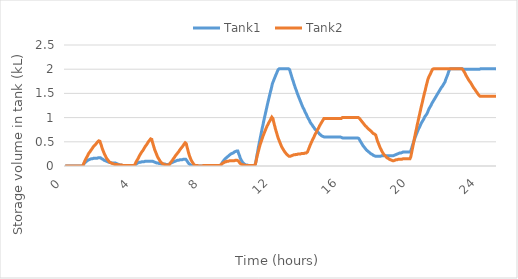
| Category | Tank1  | Tank2 |
|---|---|---|
| 0.0 | 0 | 0 |
| 0.016666666666666666 | 0 | 0 |
| 0.03333333333333333 | 0 | 0 |
| 0.05 | 0 | 0 |
| 0.06666666666666667 | 0 | 0 |
| 0.08333333333333333 | 0 | 0 |
| 0.09999999999999999 | 0 | 0 |
| 0.11666666666666665 | 0 | 0 |
| 0.13333333333333333 | 0 | 0 |
| 0.15 | 0 | 0 |
| 0.16666666666666666 | 0 | 0 |
| 0.18333333333333332 | 0 | 0 |
| 0.19999999999999998 | 0 | 0 |
| 0.21666666666666665 | 0 | 0 |
| 0.2333333333333333 | 0 | 0 |
| 0.24999999999999997 | 0 | 0 |
| 0.26666666666666666 | 0 | 0 |
| 0.2833333333333333 | 0 | 0 |
| 0.3 | 0 | 0 |
| 0.31666666666666665 | 0 | 0 |
| 0.3333333333333333 | 0 | 0 |
| 0.35 | 0 | 0 |
| 0.36666666666666664 | 0 | 0 |
| 0.3833333333333333 | 0 | 0 |
| 0.39999999999999997 | 0 | 0 |
| 0.41666666666666663 | 0 | 0 |
| 0.4333333333333333 | 0 | 0 |
| 0.44999999999999996 | 0 | 0 |
| 0.4666666666666666 | 0 | 0 |
| 0.4833333333333333 | 0 | 0 |
| 0.49999999999999994 | 0 | 0 |
| 0.5166666666666666 | 0 | 0 |
| 0.5333333333333333 | 0 | 0 |
| 0.55 | 0 | 0 |
| 0.5666666666666668 | 0 | 0 |
| 0.5833333333333335 | 0 | 0 |
| 0.6000000000000002 | 0 | 0 |
| 0.6166666666666669 | 0 | 0 |
| 0.6333333333333336 | 0 | 0 |
| 0.6500000000000004 | 0 | 0 |
| 0.6666666666666671 | 0 | 0 |
| 0.6833333333333338 | 0 | 0 |
| 0.7000000000000005 | 0 | 0 |
| 0.7166666666666672 | 0 | 0 |
| 0.733333333333334 | 0 | 0 |
| 0.7500000000000007 | 0 | 0 |
| 0.7666666666666674 | 0 | 0 |
| 0.7833333333333341 | 0 | 0 |
| 0.8000000000000008 | 0 | 0 |
| 0.8166666666666675 | 0 | 0 |
| 0.8333333333333343 | 0 | 0 |
| 0.850000000000001 | 0 | 0 |
| 0.8666666666666677 | 0 | 0 |
| 0.8833333333333344 | 0 | 0 |
| 0.9000000000000011 | 0 | 0 |
| 0.9166666666666679 | 0 | 0 |
| 0.9333333333333346 | 0 | 0 |
| 0.9500000000000013 | 0 | 0 |
| 0.966666666666668 | 0 | 0 |
| 0.9833333333333347 | 0 | 0 |
| 1.0000000000000013 | 0 | 0 |
| 1.016666666666668 | 0.01 | 0.01 |
| 1.0333333333333345 | 0.01 | 0.02 |
| 1.0500000000000012 | 0.02 | 0.03 |
| 1.0666666666666678 | 0.03 | 0.04 |
| 1.0833333333333344 | 0.04 | 0.05 |
| 1.100000000000001 | 0.05 | 0.07 |
| 1.1166666666666676 | 0.06 | 0.08 |
| 1.1333333333333342 | 0.06 | 0.09 |
| 1.1500000000000008 | 0.07 | 0.11 |
| 1.1666666666666674 | 0.08 | 0.12 |
| 1.183333333333334 | 0.08 | 0.13 |
| 1.2000000000000006 | 0.09 | 0.15 |
| 1.2166666666666672 | 0.09 | 0.16 |
| 1.2333333333333338 | 0.1 | 0.17 |
| 1.2500000000000004 | 0.1 | 0.18 |
| 1.266666666666667 | 0.11 | 0.19 |
| 1.2833333333333337 | 0.11 | 0.2 |
| 1.3000000000000003 | 0.12 | 0.21 |
| 1.3166666666666669 | 0.12 | 0.23 |
| 1.3333333333333335 | 0.12 | 0.24 |
| 1.35 | 0.13 | 0.25 |
| 1.3666666666666667 | 0.13 | 0.26 |
| 1.3833333333333333 | 0.13 | 0.27 |
| 1.4 | 0.13 | 0.28 |
| 1.4166666666666665 | 0.14 | 0.28 |
| 1.4333333333333331 | 0.14 | 0.29 |
| 1.4499999999999997 | 0.14 | 0.3 |
| 1.4666666666666663 | 0.14 | 0.31 |
| 1.483333333333333 | 0.14 | 0.32 |
| 1.4999999999999996 | 0.15 | 0.33 |
| 1.5166666666666662 | 0.15 | 0.34 |
| 1.5333333333333328 | 0.15 | 0.35 |
| 1.5499999999999994 | 0.15 | 0.35 |
| 1.566666666666666 | 0.15 | 0.36 |
| 1.5833333333333326 | 0.15 | 0.37 |
| 1.5999999999999992 | 0.15 | 0.38 |
| 1.6166666666666658 | 0.15 | 0.39 |
| 1.6333333333333324 | 0.16 | 0.39 |
| 1.649999999999999 | 0.16 | 0.4 |
| 1.6666666666666656 | 0.16 | 0.41 |
| 1.6833333333333322 | 0.16 | 0.42 |
| 1.6999999999999988 | 0.16 | 0.42 |
| 1.7166666666666655 | 0.16 | 0.43 |
| 1.733333333333332 | 0.16 | 0.44 |
| 1.7499999999999987 | 0.16 | 0.44 |
| 1.7666666666666653 | 0.16 | 0.45 |
| 1.7833333333333319 | 0.16 | 0.46 |
| 1.7999999999999985 | 0.16 | 0.46 |
| 1.816666666666665 | 0.16 | 0.47 |
| 1.8333333333333317 | 0.16 | 0.48 |
| 1.8499999999999983 | 0.16 | 0.48 |
| 1.866666666666665 | 0.17 | 0.49 |
| 1.8833333333333315 | 0.17 | 0.5 |
| 1.8999999999999981 | 0.17 | 0.5 |
| 1.9166666666666647 | 0.17 | 0.51 |
| 1.9333333333333313 | 0.17 | 0.51 |
| 1.949999999999998 | 0.17 | 0.52 |
| 1.9666666666666646 | 0.17 | 0.53 |
| 1.9833333333333312 | 0.17 | 0.53 |
| 1.9999999999999978 | 0.17 | 0.52 |
| 2.0166666666666644 | 0.17 | 0.51 |
| 2.033333333333331 | 0.17 | 0.49 |
| 2.0499999999999976 | 0.17 | 0.47 |
| 2.066666666666664 | 0.16 | 0.45 |
| 2.083333333333331 | 0.16 | 0.44 |
| 2.0999999999999974 | 0.16 | 0.42 |
| 2.116666666666664 | 0.15 | 0.4 |
| 2.1333333333333306 | 0.15 | 0.38 |
| 2.1499999999999972 | 0.14 | 0.36 |
| 2.166666666666664 | 0.14 | 0.35 |
| 2.1833333333333305 | 0.14 | 0.33 |
| 2.199999999999997 | 0.13 | 0.31 |
| 2.2166666666666637 | 0.13 | 0.3 |
| 2.2333333333333303 | 0.12 | 0.28 |
| 2.249999999999997 | 0.12 | 0.27 |
| 2.2666666666666635 | 0.12 | 0.26 |
| 2.28333333333333 | 0.11 | 0.24 |
| 2.2999999999999967 | 0.11 | 0.23 |
| 2.3166666666666633 | 0.11 | 0.22 |
| 2.33333333333333 | 0.1 | 0.21 |
| 2.3499999999999965 | 0.1 | 0.19 |
| 2.366666666666663 | 0.1 | 0.18 |
| 2.3833333333333298 | 0.1 | 0.17 |
| 2.3999999999999964 | 0.09 | 0.16 |
| 2.416666666666663 | 0.09 | 0.15 |
| 2.4333333333333296 | 0.09 | 0.15 |
| 2.449999999999996 | 0.09 | 0.14 |
| 2.466666666666663 | 0.09 | 0.13 |
| 2.4833333333333294 | 0.08 | 0.12 |
| 2.499999999999996 | 0.08 | 0.11 |
| 2.5166666666666626 | 0.08 | 0.11 |
| 2.533333333333329 | 0.08 | 0.1 |
| 2.549999999999996 | 0.08 | 0.09 |
| 2.5666666666666624 | 0.08 | 0.09 |
| 2.583333333333329 | 0.07 | 0.08 |
| 2.5999999999999956 | 0.07 | 0.08 |
| 2.6166666666666623 | 0.07 | 0.07 |
| 2.633333333333329 | 0.07 | 0.07 |
| 2.6499999999999955 | 0.07 | 0.07 |
| 2.666666666666662 | 0.07 | 0.06 |
| 2.6833333333333287 | 0.07 | 0.06 |
| 2.6999999999999953 | 0.07 | 0.05 |
| 2.716666666666662 | 0.06 | 0.05 |
| 2.7333333333333285 | 0.06 | 0.05 |
| 2.749999999999995 | 0.06 | 0.05 |
| 2.7666666666666617 | 0.06 | 0.04 |
| 2.7833333333333283 | 0.06 | 0.04 |
| 2.799999999999995 | 0.06 | 0.04 |
| 2.8166666666666615 | 0.06 | 0.04 |
| 2.833333333333328 | 0.06 | 0.04 |
| 2.8499999999999948 | 0.06 | 0.04 |
| 2.8666666666666614 | 0.06 | 0.03 |
| 2.883333333333328 | 0.06 | 0.03 |
| 2.8999999999999946 | 0.06 | 0.03 |
| 2.916666666666661 | 0.06 | 0.03 |
| 2.933333333333328 | 0.06 | 0.03 |
| 2.9499999999999944 | 0.06 | 0.03 |
| 2.966666666666661 | 0.05 | 0.03 |
| 2.9833333333333276 | 0.05 | 0.03 |
| 2.9999999999999942 | 0.05 | 0.03 |
| 3.016666666666661 | 0.05 | 0.03 |
| 3.0333333333333274 | 0.05 | 0.03 |
| 3.049999999999994 | 0.04 | 0.03 |
| 3.0666666666666607 | 0.04 | 0.03 |
| 3.0833333333333273 | 0.04 | 0.02 |
| 3.099999999999994 | 0.03 | 0.02 |
| 3.1166666666666605 | 0.03 | 0.02 |
| 3.133333333333327 | 0.03 | 0.02 |
| 3.1499999999999937 | 0.03 | 0.02 |
| 3.1666666666666603 | 0.02 | 0.02 |
| 3.183333333333327 | 0.02 | 0.02 |
| 3.1999999999999935 | 0.02 | 0.02 |
| 3.21666666666666 | 0.02 | 0.02 |
| 3.2333333333333267 | 0.02 | 0.02 |
| 3.2499999999999933 | 0.02 | 0.02 |
| 3.26666666666666 | 0.02 | 0.02 |
| 3.2833333333333266 | 0.01 | 0.02 |
| 3.299999999999993 | 0.01 | 0.02 |
| 3.3166666666666598 | 0.01 | 0.02 |
| 3.3333333333333264 | 0.01 | 0.02 |
| 3.349999999999993 | 0.01 | 0.01 |
| 3.3666666666666596 | 0.01 | 0.01 |
| 3.383333333333326 | 0.01 | 0.01 |
| 3.399999999999993 | 0.01 | 0.01 |
| 3.4166666666666594 | 0.01 | 0.01 |
| 3.433333333333326 | 0.01 | 0.01 |
| 3.4499999999999926 | 0.01 | 0.01 |
| 3.4666666666666592 | 0.01 | 0.01 |
| 3.483333333333326 | 0.01 | 0.01 |
| 3.4999999999999925 | 0.01 | 0.01 |
| 3.516666666666659 | 0.01 | 0.01 |
| 3.5333333333333257 | 0.01 | 0.01 |
| 3.5499999999999923 | 0.01 | 0.01 |
| 3.566666666666659 | 0.01 | 0.01 |
| 3.5833333333333255 | 0.01 | 0.01 |
| 3.599999999999992 | 0.01 | 0.01 |
| 3.6166666666666587 | 0.01 | 0.01 |
| 3.6333333333333253 | 0.01 | 0.01 |
| 3.649999999999992 | 0.01 | 0.01 |
| 3.6666666666666585 | 0.01 | 0.01 |
| 3.683333333333325 | 0.01 | 0.01 |
| 3.6999999999999917 | 0.01 | 0.01 |
| 3.7166666666666583 | 0.01 | 0.01 |
| 3.733333333333325 | 0.01 | 0.01 |
| 3.7499999999999916 | 0.01 | 0.01 |
| 3.766666666666658 | 0.01 | 0.01 |
| 3.7833333333333248 | 0.01 | 0.01 |
| 3.7999999999999914 | 0.01 | 0.01 |
| 3.816666666666658 | 0.01 | 0.01 |
| 3.8333333333333246 | 0.01 | 0.01 |
| 3.849999999999991 | 0.01 | 0.01 |
| 3.866666666666658 | 0.01 | 0.01 |
| 3.8833333333333244 | 0.01 | 0.01 |
| 3.899999999999991 | 0.01 | 0.01 |
| 3.9166666666666576 | 0.01 | 0.01 |
| 3.9333333333333242 | 0.01 | 0.01 |
| 3.949999999999991 | 0.01 | 0.01 |
| 3.9666666666666575 | 0.01 | 0.01 |
| 3.983333333333324 | 0.01 | 0.01 |
| 3.9999999999999907 | 0.01 | 0.02 |
| 4.016666666666658 | 0.01 | 0.02 |
| 4.033333333333324 | 0.02 | 0.03 |
| 4.049999999999991 | 0.02 | 0.04 |
| 4.0666666666666575 | 0.03 | 0.05 |
| 4.083333333333324 | 0.03 | 0.06 |
| 4.099999999999991 | 0.04 | 0.08 |
| 4.116666666666657 | 0.04 | 0.09 |
| 4.133333333333324 | 0.05 | 0.1 |
| 4.149999999999991 | 0.05 | 0.11 |
| 4.166666666666657 | 0.06 | 0.12 |
| 4.183333333333324 | 0.06 | 0.13 |
| 4.19999999999999 | 0.06 | 0.14 |
| 4.216666666666657 | 0.06 | 0.15 |
| 4.233333333333324 | 0.07 | 0.16 |
| 4.24999999999999 | 0.07 | 0.17 |
| 4.266666666666657 | 0.07 | 0.18 |
| 4.2833333333333234 | 0.07 | 0.2 |
| 4.29999999999999 | 0.08 | 0.21 |
| 4.316666666666657 | 0.08 | 0.22 |
| 4.333333333333323 | 0.08 | 0.23 |
| 4.34999999999999 | 0.08 | 0.24 |
| 4.3666666666666565 | 0.08 | 0.25 |
| 4.383333333333323 | 0.08 | 0.26 |
| 4.39999999999999 | 0.08 | 0.27 |
| 4.416666666666656 | 0.09 | 0.28 |
| 4.433333333333323 | 0.09 | 0.29 |
| 4.4499999999999895 | 0.09 | 0.3 |
| 4.466666666666656 | 0.09 | 0.3 |
| 4.483333333333323 | 0.09 | 0.31 |
| 4.499999999999989 | 0.09 | 0.32 |
| 4.516666666666656 | 0.09 | 0.33 |
| 4.533333333333323 | 0.09 | 0.34 |
| 4.549999999999989 | 0.09 | 0.35 |
| 4.566666666666656 | 0.09 | 0.36 |
| 4.583333333333322 | 0.09 | 0.37 |
| 4.599999999999989 | 0.09 | 0.38 |
| 4.616666666666656 | 0.09 | 0.39 |
| 4.633333333333322 | 0.1 | 0.4 |
| 4.649999999999989 | 0.1 | 0.41 |
| 4.666666666666655 | 0.1 | 0.42 |
| 4.683333333333322 | 0.1 | 0.43 |
| 4.699999999999989 | 0.1 | 0.43 |
| 4.716666666666655 | 0.1 | 0.44 |
| 4.733333333333322 | 0.1 | 0.45 |
| 4.7499999999999885 | 0.1 | 0.46 |
| 4.766666666666655 | 0.1 | 0.47 |
| 4.783333333333322 | 0.1 | 0.48 |
| 4.799999999999988 | 0.1 | 0.49 |
| 4.816666666666655 | 0.1 | 0.5 |
| 4.8333333333333215 | 0.1 | 0.5 |
| 4.849999999999988 | 0.1 | 0.51 |
| 4.866666666666655 | 0.1 | 0.52 |
| 4.883333333333321 | 0.1 | 0.53 |
| 4.899999999999988 | 0.1 | 0.54 |
| 4.9166666666666545 | 0.1 | 0.55 |
| 4.933333333333321 | 0.1 | 0.55 |
| 4.949999999999988 | 0.1 | 0.56 |
| 4.966666666666654 | 0.1 | 0.57 |
| 4.983333333333321 | 0.1 | 0.58 |
| 4.999999999999988 | 0.1 | 0.56 |
| 5.016666666666654 | 0.1 | 0.55 |
| 5.033333333333321 | 0.1 | 0.53 |
| 5.049999999999987 | 0.1 | 0.5 |
| 5.066666666666654 | 0.1 | 0.48 |
| 5.083333333333321 | 0.1 | 0.46 |
| 5.099999999999987 | 0.09 | 0.44 |
| 5.116666666666654 | 0.09 | 0.42 |
| 5.13333333333332 | 0.09 | 0.4 |
| 5.149999999999987 | 0.09 | 0.38 |
| 5.166666666666654 | 0.08 | 0.36 |
| 5.18333333333332 | 0.08 | 0.34 |
| 5.199999999999987 | 0.08 | 0.33 |
| 5.2166666666666535 | 0.07 | 0.31 |
| 5.23333333333332 | 0.07 | 0.29 |
| 5.249999999999987 | 0.07 | 0.28 |
| 5.266666666666653 | 0.07 | 0.26 |
| 5.28333333333332 | 0.07 | 0.25 |
| 5.2999999999999865 | 0.06 | 0.23 |
| 5.316666666666653 | 0.06 | 0.22 |
| 5.33333333333332 | 0.06 | 0.21 |
| 5.349999999999986 | 0.06 | 0.19 |
| 5.366666666666653 | 0.06 | 0.18 |
| 5.3833333333333195 | 0.06 | 0.17 |
| 5.399999999999986 | 0.05 | 0.16 |
| 5.416666666666653 | 0.05 | 0.15 |
| 5.433333333333319 | 0.05 | 0.14 |
| 5.449999999999986 | 0.05 | 0.13 |
| 5.466666666666653 | 0.05 | 0.12 |
| 5.483333333333319 | 0.05 | 0.11 |
| 5.499999999999986 | 0.05 | 0.1 |
| 5.516666666666652 | 0.05 | 0.09 |
| 5.533333333333319 | 0.04 | 0.09 |
| 5.549999999999986 | 0.04 | 0.08 |
| 5.566666666666652 | 0.04 | 0.07 |
| 5.583333333333319 | 0.04 | 0.07 |
| 5.599999999999985 | 0.04 | 0.06 |
| 5.616666666666652 | 0.04 | 0.06 |
| 5.633333333333319 | 0.04 | 0.05 |
| 5.649999999999985 | 0.04 | 0.05 |
| 5.666666666666652 | 0.04 | 0.05 |
| 5.6833333333333185 | 0.04 | 0.04 |
| 5.699999999999985 | 0.04 | 0.04 |
| 5.716666666666652 | 0.04 | 0.04 |
| 5.733333333333318 | 0.04 | 0.03 |
| 5.749999999999985 | 0.04 | 0.03 |
| 5.7666666666666515 | 0.04 | 0.03 |
| 5.783333333333318 | 0.04 | 0.03 |
| 5.799999999999985 | 0.04 | 0.02 |
| 5.816666666666651 | 0.04 | 0.02 |
| 5.833333333333318 | 0.04 | 0.02 |
| 5.8499999999999845 | 0.03 | 0.02 |
| 5.866666666666651 | 0.03 | 0.02 |
| 5.883333333333318 | 0.03 | 0.02 |
| 5.899999999999984 | 0.03 | 0.02 |
| 5.916666666666651 | 0.03 | 0.02 |
| 5.933333333333318 | 0.03 | 0.02 |
| 5.949999999999984 | 0.03 | 0.02 |
| 5.966666666666651 | 0.03 | 0.02 |
| 5.983333333333317 | 0.03 | 0.02 |
| 5.999999999999984 | 0.03 | 0.02 |
| 6.016666666666651 | 0.04 | 0.02 |
| 6.033333333333317 | 0.04 | 0.03 |
| 6.049999999999984 | 0.04 | 0.04 |
| 6.06666666666665 | 0.05 | 0.05 |
| 6.083333333333317 | 0.05 | 0.06 |
| 6.099999999999984 | 0.05 | 0.06 |
| 6.11666666666665 | 0.06 | 0.07 |
| 6.133333333333317 | 0.06 | 0.08 |
| 6.1499999999999835 | 0.06 | 0.09 |
| 6.16666666666665 | 0.07 | 0.1 |
| 6.183333333333317 | 0.07 | 0.11 |
| 6.199999999999983 | 0.07 | 0.11 |
| 6.21666666666665 | 0.08 | 0.12 |
| 6.2333333333333165 | 0.08 | 0.13 |
| 6.249999999999983 | 0.08 | 0.14 |
| 6.26666666666665 | 0.08 | 0.15 |
| 6.283333333333316 | 0.09 | 0.16 |
| 6.299999999999983 | 0.09 | 0.16 |
| 6.3166666666666496 | 0.09 | 0.17 |
| 6.333333333333316 | 0.09 | 0.18 |
| 6.349999999999983 | 0.1 | 0.19 |
| 6.366666666666649 | 0.1 | 0.2 |
| 6.383333333333316 | 0.1 | 0.21 |
| 6.399999999999983 | 0.1 | 0.21 |
| 6.416666666666649 | 0.1 | 0.22 |
| 6.433333333333316 | 0.11 | 0.23 |
| 6.449999999999982 | 0.11 | 0.24 |
| 6.466666666666649 | 0.11 | 0.25 |
| 6.483333333333316 | 0.11 | 0.25 |
| 6.499999999999982 | 0.11 | 0.26 |
| 6.516666666666649 | 0.12 | 0.27 |
| 6.5333333333333155 | 0.12 | 0.28 |
| 6.549999999999982 | 0.12 | 0.29 |
| 6.566666666666649 | 0.12 | 0.29 |
| 6.583333333333315 | 0.12 | 0.3 |
| 6.599999999999982 | 0.12 | 0.31 |
| 6.6166666666666485 | 0.12 | 0.32 |
| 6.633333333333315 | 0.12 | 0.33 |
| 6.649999999999982 | 0.13 | 0.33 |
| 6.666666666666648 | 0.13 | 0.34 |
| 6.683333333333315 | 0.13 | 0.35 |
| 6.6999999999999815 | 0.13 | 0.36 |
| 6.716666666666648 | 0.13 | 0.37 |
| 6.733333333333315 | 0.13 | 0.37 |
| 6.749999999999981 | 0.13 | 0.38 |
| 6.766666666666648 | 0.13 | 0.39 |
| 6.783333333333315 | 0.13 | 0.4 |
| 6.799999999999981 | 0.14 | 0.41 |
| 6.816666666666648 | 0.14 | 0.41 |
| 6.833333333333314 | 0.14 | 0.42 |
| 6.849999999999981 | 0.14 | 0.43 |
| 6.866666666666648 | 0.14 | 0.44 |
| 6.883333333333314 | 0.14 | 0.45 |
| 6.899999999999981 | 0.14 | 0.45 |
| 6.916666666666647 | 0.14 | 0.46 |
| 6.933333333333314 | 0.14 | 0.47 |
| 6.949999999999981 | 0.14 | 0.48 |
| 6.966666666666647 | 0.14 | 0.49 |
| 6.983333333333314 | 0.14 | 0.49 |
| 6.9999999999999805 | 0.14 | 0.47 |
| 7.016666666666647 | 0.13 | 0.46 |
| 7.033333333333314 | 0.12 | 0.43 |
| 7.04999999999998 | 0.11 | 0.41 |
| 7.066666666666647 | 0.1 | 0.38 |
| 7.0833333333333135 | 0.09 | 0.36 |
| 7.09999999999998 | 0.08 | 0.34 |
| 7.116666666666647 | 0.08 | 0.32 |
| 7.133333333333313 | 0.07 | 0.29 |
| 7.14999999999998 | 0.06 | 0.27 |
| 7.1666666666666465 | 0.05 | 0.25 |
| 7.183333333333313 | 0.05 | 0.23 |
| 7.19999999999998 | 0.04 | 0.21 |
| 7.216666666666646 | 0.03 | 0.2 |
| 7.233333333333313 | 0.03 | 0.18 |
| 7.24999999999998 | 0.02 | 0.16 |
| 7.266666666666646 | 0.02 | 0.15 |
| 7.283333333333313 | 0.02 | 0.13 |
| 7.299999999999979 | 0.01 | 0.12 |
| 7.316666666666646 | 0.01 | 0.11 |
| 7.333333333333313 | 0.01 | 0.1 |
| 7.349999999999979 | 0.01 | 0.09 |
| 7.366666666666646 | 0.01 | 0.08 |
| 7.383333333333312 | 0.01 | 0.07 |
| 7.399999999999979 | 0.01 | 0.06 |
| 7.416666666666646 | 0.01 | 0.05 |
| 7.433333333333312 | 0.01 | 0.04 |
| 7.449999999999979 | 0.01 | 0.04 |
| 7.4666666666666455 | 0 | 0.03 |
| 7.483333333333312 | 0 | 0.02 |
| 7.499999999999979 | 0 | 0.02 |
| 7.516666666666645 | 0 | 0.02 |
| 7.533333333333312 | 0 | 0.01 |
| 7.5499999999999785 | 0 | 0.01 |
| 7.566666666666645 | 0 | 0.01 |
| 7.583333333333312 | 0 | 0.01 |
| 7.599999999999978 | 0 | 0.01 |
| 7.616666666666645 | 0 | 0.01 |
| 7.6333333333333115 | 0 | 0.01 |
| 7.649999999999978 | 0 | 0.01 |
| 7.666666666666645 | 0 | 0.01 |
| 7.683333333333311 | 0 | 0 |
| 7.699999999999978 | 0 | 0 |
| 7.716666666666645 | 0 | 0 |
| 7.733333333333311 | 0 | 0 |
| 7.749999999999978 | 0 | 0 |
| 7.766666666666644 | 0 | 0 |
| 7.783333333333311 | 0 | 0 |
| 7.799999999999978 | 0 | 0 |
| 7.816666666666644 | 0 | 0 |
| 7.833333333333311 | 0 | 0 |
| 7.849999999999977 | 0 | 0 |
| 7.866666666666644 | 0 | 0 |
| 7.883333333333311 | 0 | 0 |
| 7.899999999999977 | 0 | 0 |
| 7.916666666666644 | 0 | 0 |
| 7.9333333333333105 | 0 | 0 |
| 7.949999999999977 | 0 | 0 |
| 7.966666666666644 | 0 | 0 |
| 7.98333333333331 | 0 | 0 |
| 7.999999999999977 | 0.01 | 0.01 |
| 8.016666666666644 | 0.01 | 0.01 |
| 8.033333333333312 | 0.01 | 0.01 |
| 8.04999999999998 | 0.01 | 0.01 |
| 8.066666666666647 | 0.01 | 0.01 |
| 8.083333333333314 | 0.01 | 0.01 |
| 8.099999999999982 | 0.01 | 0.01 |
| 8.11666666666665 | 0.01 | 0.01 |
| 8.133333333333317 | 0.01 | 0.01 |
| 8.149999999999984 | 0.01 | 0.01 |
| 8.166666666666652 | 0.01 | 0.01 |
| 8.18333333333332 | 0.01 | 0.01 |
| 8.199999999999987 | 0.01 | 0.01 |
| 8.216666666666654 | 0.01 | 0.01 |
| 8.233333333333322 | 0.01 | 0.01 |
| 8.24999999999999 | 0.01 | 0.01 |
| 8.266666666666657 | 0.01 | 0.01 |
| 8.283333333333324 | 0.01 | 0.01 |
| 8.299999999999992 | 0.01 | 0.01 |
| 8.31666666666666 | 0.01 | 0.01 |
| 8.333333333333327 | 0.01 | 0.01 |
| 8.349999999999994 | 0.01 | 0.01 |
| 8.366666666666662 | 0.01 | 0.01 |
| 8.38333333333333 | 0.01 | 0.01 |
| 8.399999999999997 | 0.01 | 0.01 |
| 8.416666666666664 | 0.01 | 0.01 |
| 8.433333333333332 | 0.01 | 0.01 |
| 8.45 | 0.01 | 0.01 |
| 8.466666666666667 | 0.01 | 0.01 |
| 8.483333333333334 | 0.01 | 0.01 |
| 8.500000000000002 | 0.01 | 0.01 |
| 8.51666666666667 | 0.01 | 0.01 |
| 8.533333333333337 | 0.01 | 0.01 |
| 8.550000000000004 | 0.01 | 0.01 |
| 8.566666666666672 | 0.01 | 0.01 |
| 8.58333333333334 | 0.01 | 0.01 |
| 8.600000000000007 | 0.01 | 0.01 |
| 8.616666666666674 | 0.01 | 0.01 |
| 8.633333333333342 | 0.01 | 0.01 |
| 8.65000000000001 | 0.01 | 0.01 |
| 8.666666666666677 | 0.01 | 0.01 |
| 8.683333333333344 | 0.01 | 0.01 |
| 8.700000000000012 | 0.01 | 0.01 |
| 8.71666666666668 | 0.01 | 0.01 |
| 8.733333333333347 | 0.01 | 0.01 |
| 8.750000000000014 | 0.01 | 0.01 |
| 8.766666666666682 | 0.01 | 0.01 |
| 8.78333333333335 | 0.01 | 0.01 |
| 8.800000000000017 | 0.01 | 0.01 |
| 8.816666666666684 | 0.01 | 0.01 |
| 8.833333333333352 | 0.01 | 0.01 |
| 8.85000000000002 | 0.01 | 0.01 |
| 8.866666666666687 | 0.01 | 0.01 |
| 8.883333333333354 | 0.01 | 0.01 |
| 8.900000000000022 | 0.01 | 0.01 |
| 8.91666666666669 | 0.01 | 0.01 |
| 8.933333333333357 | 0.01 | 0.01 |
| 8.950000000000024 | 0.01 | 0.01 |
| 8.966666666666692 | 0.01 | 0.01 |
| 8.98333333333336 | 0.01 | 0.01 |
| 9.000000000000027 | 0.02 | 0.02 |
| 9.016666666666694 | 0.02 | 0.02 |
| 9.033333333333362 | 0.03 | 0.03 |
| 9.05000000000003 | 0.04 | 0.03 |
| 9.066666666666697 | 0.05 | 0.04 |
| 9.083333333333364 | 0.06 | 0.04 |
| 9.100000000000032 | 0.07 | 0.05 |
| 9.1166666666667 | 0.08 | 0.05 |
| 9.133333333333367 | 0.09 | 0.06 |
| 9.150000000000034 | 0.1 | 0.06 |
| 9.166666666666702 | 0.1 | 0.07 |
| 9.183333333333369 | 0.11 | 0.07 |
| 9.200000000000037 | 0.12 | 0.07 |
| 9.216666666666704 | 0.13 | 0.08 |
| 9.233333333333372 | 0.13 | 0.08 |
| 9.250000000000039 | 0.14 | 0.08 |
| 9.266666666666707 | 0.15 | 0.09 |
| 9.283333333333374 | 0.15 | 0.09 |
| 9.300000000000042 | 0.16 | 0.09 |
| 9.316666666666709 | 0.17 | 0.09 |
| 9.333333333333377 | 0.17 | 0.09 |
| 9.350000000000044 | 0.18 | 0.1 |
| 9.366666666666712 | 0.18 | 0.1 |
| 9.383333333333379 | 0.19 | 0.1 |
| 9.400000000000047 | 0.19 | 0.1 |
| 9.416666666666714 | 0.2 | 0.1 |
| 9.433333333333382 | 0.2 | 0.1 |
| 9.450000000000049 | 0.21 | 0.1 |
| 9.466666666666717 | 0.21 | 0.1 |
| 9.483333333333384 | 0.22 | 0.1 |
| 9.500000000000052 | 0.22 | 0.11 |
| 9.516666666666719 | 0.23 | 0.11 |
| 9.533333333333387 | 0.23 | 0.11 |
| 9.550000000000054 | 0.23 | 0.11 |
| 9.566666666666721 | 0.24 | 0.11 |
| 9.583333333333389 | 0.24 | 0.11 |
| 9.600000000000056 | 0.25 | 0.11 |
| 9.616666666666724 | 0.25 | 0.11 |
| 9.633333333333391 | 0.25 | 0.11 |
| 9.650000000000059 | 0.26 | 0.11 |
| 9.666666666666726 | 0.26 | 0.11 |
| 9.683333333333394 | 0.26 | 0.11 |
| 9.700000000000061 | 0.27 | 0.11 |
| 9.716666666666729 | 0.27 | 0.11 |
| 9.733333333333396 | 0.27 | 0.11 |
| 9.750000000000064 | 0.28 | 0.11 |
| 9.766666666666731 | 0.28 | 0.11 |
| 9.783333333333399 | 0.28 | 0.11 |
| 9.800000000000066 | 0.29 | 0.11 |
| 9.816666666666734 | 0.29 | 0.11 |
| 9.833333333333401 | 0.29 | 0.12 |
| 9.850000000000069 | 0.29 | 0.12 |
| 9.866666666666736 | 0.3 | 0.12 |
| 9.883333333333404 | 0.3 | 0.12 |
| 9.900000000000071 | 0.3 | 0.12 |
| 9.916666666666739 | 0.3 | 0.12 |
| 9.933333333333406 | 0.31 | 0.12 |
| 9.950000000000074 | 0.31 | 0.12 |
| 9.966666666666741 | 0.31 | 0.12 |
| 9.983333333333409 | 0.31 | 0.12 |
| 10.000000000000076 | 0.31 | 0.11 |
| 10.016666666666744 | 0.29 | 0.11 |
| 10.033333333333411 | 0.27 | 0.1 |
| 10.050000000000079 | 0.26 | 0.09 |
| 10.066666666666746 | 0.24 | 0.09 |
| 10.083333333333414 | 0.22 | 0.08 |
| 10.100000000000081 | 0.21 | 0.07 |
| 10.116666666666749 | 0.19 | 0.06 |
| 10.133333333333416 | 0.17 | 0.06 |
| 10.150000000000084 | 0.16 | 0.05 |
| 10.166666666666751 | 0.15 | 0.05 |
| 10.183333333333419 | 0.13 | 0.04 |
| 10.200000000000086 | 0.12 | 0.04 |
| 10.216666666666754 | 0.11 | 0.03 |
| 10.233333333333421 | 0.1 | 0.03 |
| 10.250000000000089 | 0.09 | 0.03 |
| 10.266666666666756 | 0.08 | 0.03 |
| 10.283333333333424 | 0.07 | 0.02 |
| 10.300000000000091 | 0.07 | 0.02 |
| 10.316666666666759 | 0.06 | 0.02 |
| 10.333333333333426 | 0.05 | 0.02 |
| 10.350000000000094 | 0.05 | 0.02 |
| 10.366666666666761 | 0.04 | 0.02 |
| 10.383333333333429 | 0.04 | 0.02 |
| 10.400000000000096 | 0.04 | 0.01 |
| 10.416666666666764 | 0.03 | 0.01 |
| 10.433333333333431 | 0.03 | 0.01 |
| 10.450000000000099 | 0.03 | 0.01 |
| 10.466666666666766 | 0.02 | 0.01 |
| 10.483333333333434 | 0.02 | 0.01 |
| 10.500000000000101 | 0.02 | 0.01 |
| 10.516666666666769 | 0.02 | 0.01 |
| 10.533333333333436 | 0.02 | 0.01 |
| 10.550000000000104 | 0.02 | 0.01 |
| 10.566666666666771 | 0.02 | 0.01 |
| 10.583333333333439 | 0.01 | 0.01 |
| 10.600000000000106 | 0.01 | 0.01 |
| 10.616666666666774 | 0.01 | 0.01 |
| 10.633333333333441 | 0.01 | 0.01 |
| 10.650000000000109 | 0.01 | 0.01 |
| 10.666666666666776 | 0.01 | 0.01 |
| 10.683333333333444 | 0.01 | 0.01 |
| 10.700000000000111 | 0.01 | 0.01 |
| 10.716666666666779 | 0.01 | 0.01 |
| 10.733333333333446 | 0.01 | 0.01 |
| 10.750000000000114 | 0.01 | 0.01 |
| 10.766666666666781 | 0.01 | 0.01 |
| 10.783333333333449 | 0.01 | 0.01 |
| 10.800000000000116 | 0.01 | 0.01 |
| 10.816666666666784 | 0.01 | 0.01 |
| 10.833333333333451 | 0.01 | 0.01 |
| 10.850000000000119 | 0.01 | 0.01 |
| 10.866666666666786 | 0.01 | 0.01 |
| 10.883333333333454 | 0.01 | 0.01 |
| 10.900000000000121 | 0.01 | 0.01 |
| 10.916666666666789 | 0.01 | 0.01 |
| 10.933333333333456 | 0.01 | 0.01 |
| 10.950000000000124 | 0.01 | 0.01 |
| 10.966666666666791 | 0.01 | 0.01 |
| 10.983333333333459 | 0.01 | 0.01 |
| 11.000000000000126 | 0.02 | 0.02 |
| 11.016666666666794 | 0.04 | 0.04 |
| 11.033333333333461 | 0.07 | 0.06 |
| 11.050000000000129 | 0.1 | 0.09 |
| 11.066666666666796 | 0.14 | 0.12 |
| 11.083333333333464 | 0.17 | 0.15 |
| 11.100000000000131 | 0.2 | 0.17 |
| 11.116666666666799 | 0.24 | 0.2 |
| 11.133333333333466 | 0.27 | 0.23 |
| 11.150000000000134 | 0.3 | 0.25 |
| 11.166666666666801 | 0.33 | 0.27 |
| 11.183333333333469 | 0.37 | 0.3 |
| 11.200000000000136 | 0.4 | 0.32 |
| 11.216666666666804 | 0.43 | 0.34 |
| 11.233333333333471 | 0.46 | 0.36 |
| 11.250000000000139 | 0.49 | 0.39 |
| 11.266666666666806 | 0.52 | 0.41 |
| 11.283333333333474 | 0.55 | 0.43 |
| 11.300000000000141 | 0.58 | 0.45 |
| 11.316666666666809 | 0.61 | 0.47 |
| 11.333333333333476 | 0.64 | 0.48 |
| 11.350000000000144 | 0.67 | 0.5 |
| 11.366666666666811 | 0.7 | 0.52 |
| 11.383333333333479 | 0.73 | 0.54 |
| 11.400000000000146 | 0.76 | 0.56 |
| 11.416666666666814 | 0.79 | 0.57 |
| 11.433333333333481 | 0.81 | 0.59 |
| 11.450000000000149 | 0.84 | 0.61 |
| 11.466666666666816 | 0.87 | 0.62 |
| 11.483333333333483 | 0.9 | 0.64 |
| 11.500000000000151 | 0.93 | 0.66 |
| 11.516666666666818 | 0.95 | 0.67 |
| 11.533333333333486 | 0.98 | 0.69 |
| 11.550000000000153 | 1.01 | 0.7 |
| 11.566666666666821 | 1.03 | 0.72 |
| 11.583333333333488 | 1.06 | 0.73 |
| 11.600000000000156 | 1.09 | 0.75 |
| 11.616666666666823 | 1.11 | 0.76 |
| 11.633333333333491 | 1.14 | 0.77 |
| 11.650000000000158 | 1.17 | 0.79 |
| 11.666666666666826 | 1.19 | 0.8 |
| 11.683333333333493 | 1.22 | 0.81 |
| 11.700000000000161 | 1.25 | 0.83 |
| 11.716666666666828 | 1.27 | 0.84 |
| 11.733333333333496 | 1.3 | 0.85 |
| 11.750000000000163 | 1.32 | 0.86 |
| 11.766666666666831 | 1.35 | 0.88 |
| 11.783333333333498 | 1.37 | 0.89 |
| 11.800000000000166 | 1.4 | 0.9 |
| 11.816666666666833 | 1.42 | 0.91 |
| 11.833333333333501 | 1.45 | 0.92 |
| 11.850000000000168 | 1.47 | 0.93 |
| 11.866666666666836 | 1.5 | 0.94 |
| 11.883333333333503 | 1.52 | 0.95 |
| 11.90000000000017 | 1.55 | 0.97 |
| 11.916666666666838 | 1.57 | 0.98 |
| 11.933333333333506 | 1.59 | 0.99 |
| 11.950000000000173 | 1.62 | 1 |
| 11.96666666666684 | 1.64 | 1.01 |
| 11.983333333333508 | 1.67 | 1.02 |
| 12.000000000000176 | 1.7 | 1.01 |
| 12.016666666666843 | 1.72 | 0.99 |
| 12.03333333333351 | 1.73 | 0.98 |
| 12.050000000000178 | 1.75 | 0.95 |
| 12.066666666666846 | 1.76 | 0.93 |
| 12.083333333333513 | 1.78 | 0.9 |
| 12.10000000000018 | 1.79 | 0.88 |
| 12.116666666666848 | 1.81 | 0.85 |
| 12.133333333333516 | 1.82 | 0.83 |
| 12.150000000000183 | 1.83 | 0.81 |
| 12.16666666666685 | 1.85 | 0.78 |
| 12.183333333333518 | 1.86 | 0.76 |
| 12.200000000000186 | 1.88 | 0.74 |
| 12.216666666666853 | 1.89 | 0.72 |
| 12.23333333333352 | 1.9 | 0.7 |
| 12.250000000000188 | 1.92 | 0.68 |
| 12.266666666666856 | 1.93 | 0.66 |
| 12.283333333333523 | 1.95 | 0.64 |
| 12.30000000000019 | 1.96 | 0.62 |
| 12.316666666666858 | 1.97 | 0.6 |
| 12.333333333333526 | 1.99 | 0.58 |
| 12.350000000000193 | 2 | 0.57 |
| 12.36666666666686 | 2.01 | 0.55 |
| 12.383333333333528 | 2.01 | 0.53 |
| 12.400000000000196 | 2.01 | 0.52 |
| 12.416666666666863 | 2.01 | 0.5 |
| 12.43333333333353 | 2.01 | 0.49 |
| 12.450000000000198 | 2.01 | 0.47 |
| 12.466666666666866 | 2.01 | 0.46 |
| 12.483333333333533 | 2.01 | 0.44 |
| 12.5000000000002 | 2.01 | 0.43 |
| 12.516666666666868 | 2.01 | 0.42 |
| 12.533333333333536 | 2.01 | 0.41 |
| 12.550000000000203 | 2.01 | 0.39 |
| 12.56666666666687 | 2.01 | 0.38 |
| 12.583333333333538 | 2.01 | 0.37 |
| 12.600000000000206 | 2.01 | 0.36 |
| 12.616666666666873 | 2.01 | 0.35 |
| 12.63333333333354 | 2.01 | 0.34 |
| 12.650000000000208 | 2.01 | 0.33 |
| 12.666666666666876 | 2.01 | 0.32 |
| 12.683333333333543 | 2.01 | 0.31 |
| 12.70000000000021 | 2.01 | 0.3 |
| 12.716666666666878 | 2.01 | 0.29 |
| 12.733333333333546 | 2.01 | 0.28 |
| 12.750000000000213 | 2.01 | 0.28 |
| 12.76666666666688 | 2.01 | 0.27 |
| 12.783333333333548 | 2.01 | 0.26 |
| 12.800000000000216 | 2.01 | 0.25 |
| 12.816666666666883 | 2.01 | 0.25 |
| 12.83333333333355 | 2.01 | 0.24 |
| 12.850000000000218 | 2.01 | 0.24 |
| 12.866666666666886 | 2.01 | 0.23 |
| 12.883333333333553 | 2.01 | 0.22 |
| 12.90000000000022 | 2.01 | 0.22 |
| 12.916666666666888 | 2.01 | 0.21 |
| 12.933333333333556 | 2.01 | 0.21 |
| 12.950000000000223 | 2.01 | 0.2 |
| 12.96666666666689 | 2.01 | 0.2 |
| 12.983333333333558 | 2.01 | 0.2 |
| 13.000000000000226 | 1.99 | 0.2 |
| 13.016666666666893 | 1.97 | 0.2 |
| 13.03333333333356 | 1.95 | 0.2 |
| 13.050000000000228 | 1.93 | 0.21 |
| 13.066666666666896 | 1.91 | 0.21 |
| 13.083333333333563 | 1.89 | 0.21 |
| 13.10000000000023 | 1.87 | 0.21 |
| 13.116666666666898 | 1.85 | 0.21 |
| 13.133333333333566 | 1.83 | 0.22 |
| 13.150000000000233 | 1.81 | 0.22 |
| 13.1666666666669 | 1.79 | 0.22 |
| 13.183333333333568 | 1.77 | 0.22 |
| 13.200000000000236 | 1.76 | 0.22 |
| 13.216666666666903 | 1.74 | 0.22 |
| 13.23333333333357 | 1.72 | 0.23 |
| 13.250000000000238 | 1.7 | 0.23 |
| 13.266666666666906 | 1.68 | 0.23 |
| 13.283333333333573 | 1.67 | 0.23 |
| 13.30000000000024 | 1.65 | 0.23 |
| 13.316666666666908 | 1.63 | 0.23 |
| 13.333333333333576 | 1.61 | 0.23 |
| 13.350000000000243 | 1.6 | 0.24 |
| 13.36666666666691 | 1.58 | 0.24 |
| 13.383333333333578 | 1.56 | 0.24 |
| 13.400000000000245 | 1.55 | 0.24 |
| 13.416666666666913 | 1.53 | 0.24 |
| 13.43333333333358 | 1.51 | 0.24 |
| 13.450000000000248 | 1.5 | 0.24 |
| 13.466666666666915 | 1.48 | 0.24 |
| 13.483333333333583 | 1.46 | 0.24 |
| 13.50000000000025 | 1.45 | 0.25 |
| 13.516666666666918 | 1.43 | 0.25 |
| 13.533333333333585 | 1.42 | 0.25 |
| 13.550000000000253 | 1.4 | 0.25 |
| 13.56666666666692 | 1.39 | 0.25 |
| 13.583333333333588 | 1.37 | 0.25 |
| 13.600000000000255 | 1.36 | 0.25 |
| 13.616666666666923 | 1.34 | 0.25 |
| 13.63333333333359 | 1.33 | 0.25 |
| 13.650000000000258 | 1.31 | 0.25 |
| 13.666666666666925 | 1.3 | 0.26 |
| 13.683333333333593 | 1.29 | 0.26 |
| 13.70000000000026 | 1.27 | 0.26 |
| 13.716666666666928 | 1.26 | 0.26 |
| 13.733333333333595 | 1.24 | 0.26 |
| 13.750000000000263 | 1.23 | 0.26 |
| 13.76666666666693 | 1.22 | 0.26 |
| 13.783333333333598 | 1.2 | 0.26 |
| 13.800000000000265 | 1.19 | 0.26 |
| 13.816666666666933 | 1.18 | 0.26 |
| 13.8333333333336 | 1.17 | 0.26 |
| 13.850000000000268 | 1.15 | 0.26 |
| 13.866666666666935 | 1.14 | 0.26 |
| 13.883333333333603 | 1.13 | 0.26 |
| 13.90000000000027 | 1.12 | 0.27 |
| 13.916666666666938 | 1.1 | 0.27 |
| 13.933333333333605 | 1.09 | 0.27 |
| 13.950000000000273 | 1.08 | 0.27 |
| 13.96666666666694 | 1.07 | 0.27 |
| 13.983333333333608 | 1.06 | 0.27 |
| 14.000000000000275 | 1.04 | 0.28 |
| 14.016666666666943 | 1.03 | 0.28 |
| 14.03333333333361 | 1.02 | 0.29 |
| 14.050000000000278 | 1 | 0.3 |
| 14.066666666666945 | 0.99 | 0.32 |
| 14.083333333333613 | 0.98 | 0.33 |
| 14.10000000000028 | 0.97 | 0.35 |
| 14.116666666666948 | 0.96 | 0.36 |
| 14.133333333333615 | 0.95 | 0.38 |
| 14.150000000000283 | 0.94 | 0.39 |
| 14.16666666666695 | 0.92 | 0.41 |
| 14.183333333333618 | 0.91 | 0.42 |
| 14.200000000000285 | 0.9 | 0.44 |
| 14.216666666666953 | 0.89 | 0.45 |
| 14.23333333333362 | 0.88 | 0.46 |
| 14.250000000000288 | 0.87 | 0.48 |
| 14.266666666666955 | 0.87 | 0.49 |
| 14.283333333333623 | 0.86 | 0.5 |
| 14.30000000000029 | 0.85 | 0.52 |
| 14.316666666666958 | 0.84 | 0.53 |
| 14.333333333333625 | 0.83 | 0.54 |
| 14.350000000000293 | 0.82 | 0.56 |
| 14.36666666666696 | 0.81 | 0.57 |
| 14.383333333333628 | 0.8 | 0.58 |
| 14.400000000000295 | 0.8 | 0.59 |
| 14.416666666666963 | 0.79 | 0.61 |
| 14.43333333333363 | 0.78 | 0.62 |
| 14.450000000000298 | 0.77 | 0.63 |
| 14.466666666666965 | 0.76 | 0.64 |
| 14.483333333333633 | 0.76 | 0.66 |
| 14.5000000000003 | 0.75 | 0.67 |
| 14.516666666666968 | 0.74 | 0.68 |
| 14.533333333333635 | 0.74 | 0.69 |
| 14.550000000000303 | 0.73 | 0.7 |
| 14.56666666666697 | 0.72 | 0.71 |
| 14.583333333333638 | 0.72 | 0.73 |
| 14.600000000000305 | 0.71 | 0.74 |
| 14.616666666666973 | 0.7 | 0.75 |
| 14.63333333333364 | 0.7 | 0.76 |
| 14.650000000000308 | 0.69 | 0.77 |
| 14.666666666666975 | 0.69 | 0.78 |
| 14.683333333333643 | 0.68 | 0.79 |
| 14.70000000000031 | 0.67 | 0.8 |
| 14.716666666666978 | 0.67 | 0.81 |
| 14.733333333333645 | 0.66 | 0.83 |
| 14.750000000000313 | 0.66 | 0.84 |
| 14.76666666666698 | 0.65 | 0.85 |
| 14.783333333333648 | 0.65 | 0.86 |
| 14.800000000000315 | 0.64 | 0.87 |
| 14.816666666666983 | 0.64 | 0.88 |
| 14.83333333333365 | 0.63 | 0.89 |
| 14.850000000000318 | 0.63 | 0.9 |
| 14.866666666666985 | 0.62 | 0.91 |
| 14.883333333333653 | 0.62 | 0.92 |
| 14.90000000000032 | 0.61 | 0.93 |
| 14.916666666666988 | 0.61 | 0.94 |
| 14.933333333333655 | 0.61 | 0.95 |
| 14.950000000000323 | 0.6 | 0.96 |
| 14.96666666666699 | 0.6 | 0.97 |
| 14.983333333333658 | 0.59 | 0.98 |
| 15.000000000000325 | 0.6 | 0.98 |
| 15.016666666666993 | 0.6 | 0.98 |
| 15.03333333333366 | 0.6 | 0.98 |
| 15.050000000000328 | 0.6 | 0.98 |
| 15.066666666666995 | 0.6 | 0.98 |
| 15.083333333333663 | 0.6 | 0.98 |
| 15.10000000000033 | 0.6 | 0.98 |
| 15.116666666666998 | 0.6 | 0.98 |
| 15.133333333333665 | 0.6 | 0.98 |
| 15.150000000000333 | 0.6 | 0.98 |
| 15.166666666667 | 0.6 | 0.98 |
| 15.183333333333668 | 0.6 | 0.98 |
| 15.200000000000335 | 0.6 | 0.98 |
| 15.216666666667003 | 0.6 | 0.98 |
| 15.23333333333367 | 0.6 | 0.98 |
| 15.250000000000338 | 0.6 | 0.98 |
| 15.266666666667005 | 0.6 | 0.98 |
| 15.283333333333672 | 0.6 | 0.98 |
| 15.30000000000034 | 0.6 | 0.98 |
| 15.316666666667007 | 0.6 | 0.98 |
| 15.333333333333675 | 0.6 | 0.98 |
| 15.350000000000342 | 0.6 | 0.98 |
| 15.36666666666701 | 0.6 | 0.98 |
| 15.383333333333677 | 0.6 | 0.98 |
| 15.400000000000345 | 0.6 | 0.98 |
| 15.416666666667012 | 0.6 | 0.98 |
| 15.43333333333368 | 0.6 | 0.98 |
| 15.450000000000347 | 0.6 | 0.98 |
| 15.466666666667015 | 0.6 | 0.98 |
| 15.483333333333682 | 0.6 | 0.98 |
| 15.50000000000035 | 0.6 | 0.98 |
| 15.516666666667017 | 0.6 | 0.98 |
| 15.533333333333685 | 0.6 | 0.98 |
| 15.550000000000352 | 0.6 | 0.98 |
| 15.56666666666702 | 0.6 | 0.98 |
| 15.583333333333687 | 0.6 | 0.98 |
| 15.600000000000355 | 0.6 | 0.98 |
| 15.616666666667022 | 0.6 | 0.98 |
| 15.63333333333369 | 0.6 | 0.98 |
| 15.650000000000357 | 0.6 | 0.98 |
| 15.666666666667025 | 0.6 | 0.98 |
| 15.683333333333692 | 0.6 | 0.98 |
| 15.70000000000036 | 0.6 | 0.98 |
| 15.716666666667027 | 0.6 | 0.98 |
| 15.733333333333695 | 0.6 | 0.98 |
| 15.750000000000362 | 0.6 | 0.98 |
| 15.76666666666703 | 0.6 | 0.98 |
| 15.783333333333697 | 0.6 | 0.98 |
| 15.800000000000365 | 0.6 | 0.98 |
| 15.816666666667032 | 0.6 | 0.98 |
| 15.8333333333337 | 0.6 | 0.98 |
| 15.850000000000367 | 0.6 | 0.98 |
| 15.866666666667035 | 0.6 | 0.98 |
| 15.883333333333702 | 0.6 | 0.98 |
| 15.90000000000037 | 0.6 | 0.98 |
| 15.916666666667037 | 0.6 | 0.98 |
| 15.933333333333705 | 0.6 | 0.98 |
| 15.950000000000372 | 0.6 | 0.98 |
| 15.96666666666704 | 0.6 | 0.98 |
| 15.983333333333707 | 0.6 | 0.98 |
| 16.000000000000373 | 0.59 | 0.99 |
| 16.01666666666704 | 0.58 | 1 |
| 16.033333333333704 | 0.58 | 1 |
| 16.05000000000037 | 0.58 | 1 |
| 16.066666666667036 | 0.58 | 1 |
| 16.0833333333337 | 0.58 | 1 |
| 16.100000000000367 | 0.58 | 1 |
| 16.116666666667033 | 0.58 | 1 |
| 16.1333333333337 | 0.58 | 1 |
| 16.150000000000365 | 0.58 | 1 |
| 16.16666666666703 | 0.58 | 1 |
| 16.183333333333696 | 0.58 | 1 |
| 16.20000000000036 | 0.58 | 1 |
| 16.216666666667027 | 0.58 | 1 |
| 16.233333333333693 | 0.58 | 1 |
| 16.25000000000036 | 0.58 | 1 |
| 16.266666666667025 | 0.58 | 1 |
| 16.28333333333369 | 0.58 | 1 |
| 16.300000000000356 | 0.58 | 1 |
| 16.31666666666702 | 0.58 | 1 |
| 16.333333333333687 | 0.58 | 1 |
| 16.350000000000353 | 0.58 | 1 |
| 16.36666666666702 | 0.58 | 1 |
| 16.383333333333685 | 0.58 | 1 |
| 16.40000000000035 | 0.58 | 1 |
| 16.416666666667016 | 0.58 | 1 |
| 16.43333333333368 | 0.58 | 1 |
| 16.450000000000347 | 0.58 | 1 |
| 16.466666666667013 | 0.58 | 1 |
| 16.48333333333368 | 0.58 | 1 |
| 16.500000000000345 | 0.58 | 1 |
| 16.51666666666701 | 0.58 | 1 |
| 16.533333333333676 | 0.58 | 1 |
| 16.55000000000034 | 0.58 | 1 |
| 16.566666666667007 | 0.58 | 1 |
| 16.583333333333673 | 0.58 | 1 |
| 16.60000000000034 | 0.58 | 1 |
| 16.616666666667005 | 0.58 | 1 |
| 16.63333333333367 | 0.58 | 1 |
| 16.650000000000336 | 0.58 | 1 |
| 16.666666666667002 | 0.58 | 1 |
| 16.683333333333668 | 0.58 | 1 |
| 16.700000000000333 | 0.58 | 1 |
| 16.716666666667 | 0.58 | 1 |
| 16.733333333333665 | 0.58 | 1 |
| 16.75000000000033 | 0.58 | 1 |
| 16.766666666666996 | 0.58 | 1 |
| 16.783333333333662 | 0.58 | 1 |
| 16.800000000000328 | 0.58 | 1 |
| 16.816666666666993 | 0.58 | 1 |
| 16.83333333333366 | 0.58 | 1 |
| 16.850000000000325 | 0.58 | 1 |
| 16.86666666666699 | 0.58 | 1 |
| 16.883333333333656 | 0.58 | 1 |
| 16.900000000000322 | 0.58 | 1 |
| 16.916666666666988 | 0.58 | 1 |
| 16.933333333333653 | 0.58 | 1 |
| 16.95000000000032 | 0.58 | 1 |
| 16.966666666666985 | 0.58 | 1 |
| 16.98333333333365 | 0.58 | 1 |
| 17.000000000000316 | 0.57 | 1 |
| 17.016666666666982 | 0.56 | 0.99 |
| 17.033333333333648 | 0.55 | 0.99 |
| 17.050000000000313 | 0.54 | 0.98 |
| 17.06666666666698 | 0.53 | 0.97 |
| 17.083333333333645 | 0.52 | 0.97 |
| 17.10000000000031 | 0.51 | 0.96 |
| 17.116666666666976 | 0.5 | 0.95 |
| 17.133333333333642 | 0.49 | 0.94 |
| 17.150000000000308 | 0.48 | 0.93 |
| 17.166666666666973 | 0.47 | 0.93 |
| 17.18333333333364 | 0.46 | 0.92 |
| 17.200000000000305 | 0.45 | 0.91 |
| 17.21666666666697 | 0.44 | 0.9 |
| 17.233333333333636 | 0.43 | 0.9 |
| 17.250000000000302 | 0.42 | 0.89 |
| 17.266666666666968 | 0.42 | 0.88 |
| 17.283333333333633 | 0.41 | 0.88 |
| 17.3000000000003 | 0.4 | 0.87 |
| 17.316666666666965 | 0.39 | 0.86 |
| 17.33333333333363 | 0.38 | 0.85 |
| 17.350000000000296 | 0.38 | 0.85 |
| 17.366666666666962 | 0.37 | 0.84 |
| 17.383333333333628 | 0.36 | 0.83 |
| 17.400000000000293 | 0.35 | 0.83 |
| 17.41666666666696 | 0.35 | 0.82 |
| 17.433333333333625 | 0.34 | 0.81 |
| 17.45000000000029 | 0.33 | 0.81 |
| 17.466666666666956 | 0.33 | 0.8 |
| 17.483333333333622 | 0.32 | 0.8 |
| 17.500000000000288 | 0.32 | 0.79 |
| 17.516666666666953 | 0.31 | 0.78 |
| 17.53333333333362 | 0.3 | 0.78 |
| 17.550000000000285 | 0.3 | 0.77 |
| 17.56666666666695 | 0.29 | 0.77 |
| 17.583333333333616 | 0.29 | 0.76 |
| 17.600000000000282 | 0.28 | 0.75 |
| 17.616666666666948 | 0.28 | 0.75 |
| 17.633333333333614 | 0.27 | 0.74 |
| 17.65000000000028 | 0.27 | 0.74 |
| 17.666666666666945 | 0.26 | 0.73 |
| 17.68333333333361 | 0.26 | 0.73 |
| 17.700000000000276 | 0.26 | 0.72 |
| 17.716666666666942 | 0.25 | 0.72 |
| 17.733333333333608 | 0.25 | 0.71 |
| 17.750000000000274 | 0.24 | 0.7 |
| 17.76666666666694 | 0.24 | 0.7 |
| 17.783333333333605 | 0.24 | 0.69 |
| 17.80000000000027 | 0.23 | 0.69 |
| 17.816666666666936 | 0.23 | 0.68 |
| 17.833333333333602 | 0.23 | 0.68 |
| 17.850000000000268 | 0.22 | 0.67 |
| 17.866666666666934 | 0.22 | 0.67 |
| 17.8833333333336 | 0.22 | 0.66 |
| 17.900000000000265 | 0.21 | 0.66 |
| 17.91666666666693 | 0.21 | 0.66 |
| 17.933333333333596 | 0.21 | 0.65 |
| 17.950000000000262 | 0.21 | 0.65 |
| 17.966666666666928 | 0.2 | 0.64 |
| 17.983333333333594 | 0.2 | 0.64 |
| 18.00000000000026 | 0.2 | 0.62 |
| 18.016666666666925 | 0.2 | 0.6 |
| 18.03333333333359 | 0.2 | 0.58 |
| 18.050000000000257 | 0.2 | 0.56 |
| 18.066666666666922 | 0.2 | 0.54 |
| 18.083333333333588 | 0.2 | 0.52 |
| 18.100000000000254 | 0.2 | 0.51 |
| 18.11666666666692 | 0.2 | 0.49 |
| 18.133333333333585 | 0.2 | 0.47 |
| 18.15000000000025 | 0.2 | 0.46 |
| 18.166666666666917 | 0.2 | 0.44 |
| 18.183333333333582 | 0.2 | 0.43 |
| 18.200000000000248 | 0.2 | 0.41 |
| 18.216666666666914 | 0.2 | 0.4 |
| 18.23333333333358 | 0.2 | 0.38 |
| 18.250000000000245 | 0.2 | 0.37 |
| 18.26666666666691 | 0.21 | 0.36 |
| 18.283333333333577 | 0.21 | 0.35 |
| 18.300000000000242 | 0.21 | 0.34 |
| 18.316666666666908 | 0.21 | 0.32 |
| 18.333333333333574 | 0.21 | 0.31 |
| 18.35000000000024 | 0.21 | 0.3 |
| 18.366666666666905 | 0.21 | 0.29 |
| 18.38333333333357 | 0.21 | 0.28 |
| 18.400000000000237 | 0.21 | 0.27 |
| 18.416666666666902 | 0.21 | 0.26 |
| 18.433333333333568 | 0.21 | 0.25 |
| 18.450000000000234 | 0.21 | 0.25 |
| 18.4666666666669 | 0.21 | 0.24 |
| 18.483333333333565 | 0.21 | 0.23 |
| 18.50000000000023 | 0.21 | 0.22 |
| 18.516666666666897 | 0.21 | 0.22 |
| 18.533333333333562 | 0.21 | 0.21 |
| 18.550000000000228 | 0.21 | 0.2 |
| 18.566666666666894 | 0.21 | 0.2 |
| 18.58333333333356 | 0.21 | 0.19 |
| 18.600000000000225 | 0.21 | 0.18 |
| 18.61666666666689 | 0.21 | 0.18 |
| 18.633333333333557 | 0.21 | 0.17 |
| 18.650000000000222 | 0.21 | 0.17 |
| 18.666666666666888 | 0.21 | 0.16 |
| 18.683333333333554 | 0.21 | 0.16 |
| 18.70000000000022 | 0.21 | 0.16 |
| 18.716666666666885 | 0.21 | 0.15 |
| 18.73333333333355 | 0.21 | 0.15 |
| 18.750000000000217 | 0.21 | 0.14 |
| 18.766666666666882 | 0.21 | 0.14 |
| 18.783333333333548 | 0.21 | 0.14 |
| 18.800000000000214 | 0.21 | 0.13 |
| 18.81666666666688 | 0.21 | 0.13 |
| 18.833333333333545 | 0.21 | 0.13 |
| 18.85000000000021 | 0.21 | 0.13 |
| 18.866666666666877 | 0.21 | 0.12 |
| 18.883333333333542 | 0.21 | 0.12 |
| 18.900000000000208 | 0.21 | 0.12 |
| 18.916666666666874 | 0.21 | 0.12 |
| 18.93333333333354 | 0.21 | 0.12 |
| 18.950000000000205 | 0.21 | 0.11 |
| 18.96666666666687 | 0.21 | 0.11 |
| 18.983333333333537 | 0.21 | 0.11 |
| 19.000000000000203 | 0.21 | 0.11 |
| 19.01666666666687 | 0.21 | 0.11 |
| 19.033333333333534 | 0.22 | 0.11 |
| 19.0500000000002 | 0.22 | 0.11 |
| 19.066666666666865 | 0.22 | 0.11 |
| 19.08333333333353 | 0.22 | 0.12 |
| 19.100000000000197 | 0.23 | 0.12 |
| 19.116666666666863 | 0.23 | 0.12 |
| 19.13333333333353 | 0.23 | 0.12 |
| 19.150000000000194 | 0.24 | 0.12 |
| 19.16666666666686 | 0.24 | 0.13 |
| 19.183333333333525 | 0.24 | 0.13 |
| 19.20000000000019 | 0.24 | 0.13 |
| 19.216666666666857 | 0.25 | 0.13 |
| 19.233333333333523 | 0.25 | 0.13 |
| 19.25000000000019 | 0.25 | 0.13 |
| 19.266666666666854 | 0.25 | 0.13 |
| 19.28333333333352 | 0.26 | 0.13 |
| 19.300000000000185 | 0.26 | 0.14 |
| 19.31666666666685 | 0.26 | 0.14 |
| 19.333333333333517 | 0.26 | 0.14 |
| 19.350000000000183 | 0.26 | 0.14 |
| 19.36666666666685 | 0.27 | 0.14 |
| 19.383333333333514 | 0.27 | 0.14 |
| 19.40000000000018 | 0.27 | 0.14 |
| 19.416666666666845 | 0.27 | 0.14 |
| 19.43333333333351 | 0.27 | 0.14 |
| 19.450000000000177 | 0.27 | 0.14 |
| 19.466666666666843 | 0.28 | 0.14 |
| 19.48333333333351 | 0.28 | 0.14 |
| 19.500000000000174 | 0.28 | 0.14 |
| 19.51666666666684 | 0.28 | 0.14 |
| 19.533333333333506 | 0.28 | 0.14 |
| 19.55000000000017 | 0.28 | 0.14 |
| 19.566666666666837 | 0.29 | 0.15 |
| 19.583333333333503 | 0.29 | 0.15 |
| 19.60000000000017 | 0.29 | 0.15 |
| 19.616666666666834 | 0.29 | 0.15 |
| 19.6333333333335 | 0.29 | 0.15 |
| 19.650000000000166 | 0.29 | 0.15 |
| 19.66666666666683 | 0.29 | 0.15 |
| 19.683333333333497 | 0.29 | 0.15 |
| 19.700000000000163 | 0.29 | 0.15 |
| 19.71666666666683 | 0.29 | 0.15 |
| 19.733333333333494 | 0.29 | 0.15 |
| 19.75000000000016 | 0.29 | 0.15 |
| 19.766666666666826 | 0.29 | 0.15 |
| 19.78333333333349 | 0.29 | 0.15 |
| 19.800000000000157 | 0.29 | 0.15 |
| 19.816666666666823 | 0.29 | 0.15 |
| 19.83333333333349 | 0.29 | 0.15 |
| 19.850000000000154 | 0.29 | 0.15 |
| 19.86666666666682 | 0.29 | 0.15 |
| 19.883333333333486 | 0.29 | 0.15 |
| 19.90000000000015 | 0.29 | 0.15 |
| 19.916666666666817 | 0.29 | 0.15 |
| 19.933333333333483 | 0.29 | 0.15 |
| 19.95000000000015 | 0.29 | 0.15 |
| 19.966666666666814 | 0.29 | 0.15 |
| 19.98333333333348 | 0.29 | 0.15 |
| 20.000000000000146 | 0.3 | 0.16 |
| 20.01666666666681 | 0.31 | 0.19 |
| 20.033333333333477 | 0.33 | 0.22 |
| 20.050000000000143 | 0.35 | 0.25 |
| 20.06666666666681 | 0.37 | 0.28 |
| 20.083333333333474 | 0.39 | 0.31 |
| 20.10000000000014 | 0.41 | 0.34 |
| 20.116666666666806 | 0.43 | 0.37 |
| 20.13333333333347 | 0.45 | 0.4 |
| 20.150000000000137 | 0.46 | 0.43 |
| 20.166666666666803 | 0.48 | 0.46 |
| 20.18333333333347 | 0.5 | 0.49 |
| 20.200000000000134 | 0.52 | 0.52 |
| 20.2166666666668 | 0.54 | 0.55 |
| 20.233333333333466 | 0.55 | 0.58 |
| 20.25000000000013 | 0.57 | 0.61 |
| 20.266666666666797 | 0.59 | 0.64 |
| 20.283333333333463 | 0.6 | 0.67 |
| 20.30000000000013 | 0.62 | 0.7 |
| 20.316666666666794 | 0.63 | 0.72 |
| 20.33333333333346 | 0.65 | 0.75 |
| 20.350000000000126 | 0.66 | 0.78 |
| 20.36666666666679 | 0.68 | 0.81 |
| 20.383333333333457 | 0.69 | 0.84 |
| 20.400000000000123 | 0.71 | 0.86 |
| 20.41666666666679 | 0.72 | 0.89 |
| 20.433333333333454 | 0.74 | 0.92 |
| 20.45000000000012 | 0.75 | 0.95 |
| 20.466666666666786 | 0.76 | 0.97 |
| 20.48333333333345 | 0.78 | 1 |
| 20.500000000000117 | 0.79 | 1.03 |
| 20.516666666666783 | 0.8 | 1.05 |
| 20.53333333333345 | 0.81 | 1.08 |
| 20.550000000000114 | 0.83 | 1.11 |
| 20.56666666666678 | 0.84 | 1.13 |
| 20.583333333333446 | 0.85 | 1.16 |
| 20.60000000000011 | 0.86 | 1.19 |
| 20.616666666666777 | 0.88 | 1.21 |
| 20.633333333333443 | 0.89 | 1.24 |
| 20.65000000000011 | 0.9 | 1.26 |
| 20.666666666666774 | 0.91 | 1.29 |
| 20.68333333333344 | 0.92 | 1.31 |
| 20.700000000000106 | 0.93 | 1.34 |
| 20.71666666666677 | 0.94 | 1.37 |
| 20.733333333333437 | 0.95 | 1.39 |
| 20.750000000000103 | 0.96 | 1.42 |
| 20.76666666666677 | 0.97 | 1.44 |
| 20.783333333333434 | 0.99 | 1.47 |
| 20.8000000000001 | 1 | 1.49 |
| 20.816666666666766 | 1.01 | 1.52 |
| 20.83333333333343 | 1.02 | 1.54 |
| 20.850000000000097 | 1.03 | 1.56 |
| 20.866666666666763 | 1.03 | 1.59 |
| 20.88333333333343 | 1.04 | 1.61 |
| 20.900000000000095 | 1.05 | 1.64 |
| 20.91666666666676 | 1.06 | 1.66 |
| 20.933333333333426 | 1.07 | 1.69 |
| 20.95000000000009 | 1.08 | 1.71 |
| 20.966666666666757 | 1.09 | 1.73 |
| 20.983333333333423 | 1.1 | 1.76 |
| 21.00000000000009 | 1.12 | 1.78 |
| 21.016666666666755 | 1.14 | 1.8 |
| 21.03333333333342 | 1.15 | 1.81 |
| 21.050000000000086 | 1.16 | 1.83 |
| 21.06666666666675 | 1.17 | 1.84 |
| 21.083333333333417 | 1.19 | 1.85 |
| 21.100000000000083 | 1.2 | 1.87 |
| 21.11666666666675 | 1.21 | 1.88 |
| 21.133333333333415 | 1.22 | 1.89 |
| 21.15000000000008 | 1.23 | 1.9 |
| 21.166666666666746 | 1.24 | 1.92 |
| 21.18333333333341 | 1.25 | 1.93 |
| 21.200000000000077 | 1.26 | 1.94 |
| 21.216666666666743 | 1.27 | 1.95 |
| 21.23333333333341 | 1.29 | 1.97 |
| 21.250000000000075 | 1.3 | 1.98 |
| 21.26666666666674 | 1.31 | 1.99 |
| 21.283333333333406 | 1.32 | 2 |
| 21.30000000000007 | 1.33 | 2.01 |
| 21.316666666666737 | 1.34 | 2.01 |
| 21.333333333333403 | 1.35 | 2.01 |
| 21.35000000000007 | 1.36 | 2.01 |
| 21.366666666666735 | 1.37 | 2.01 |
| 21.3833333333334 | 1.38 | 2.01 |
| 21.400000000000066 | 1.39 | 2.01 |
| 21.416666666666732 | 1.4 | 2.01 |
| 21.433333333333398 | 1.41 | 2.01 |
| 21.450000000000063 | 1.42 | 2.01 |
| 21.46666666666673 | 1.43 | 2.01 |
| 21.483333333333395 | 1.44 | 2.01 |
| 21.50000000000006 | 1.45 | 2.01 |
| 21.516666666666726 | 1.46 | 2.01 |
| 21.533333333333392 | 1.47 | 2.01 |
| 21.550000000000058 | 1.48 | 2.01 |
| 21.566666666666723 | 1.49 | 2.01 |
| 21.58333333333339 | 1.5 | 2.01 |
| 21.600000000000055 | 1.51 | 2.01 |
| 21.61666666666672 | 1.52 | 2.01 |
| 21.633333333333386 | 1.53 | 2.01 |
| 21.650000000000052 | 1.54 | 2.01 |
| 21.666666666666718 | 1.55 | 2.01 |
| 21.683333333333383 | 1.56 | 2.01 |
| 21.70000000000005 | 1.57 | 2.01 |
| 21.716666666666715 | 1.58 | 2.01 |
| 21.73333333333338 | 1.59 | 2.01 |
| 21.750000000000046 | 1.6 | 2.01 |
| 21.766666666666712 | 1.61 | 2.01 |
| 21.783333333333378 | 1.62 | 2.01 |
| 21.800000000000043 | 1.63 | 2.01 |
| 21.81666666666671 | 1.63 | 2.01 |
| 21.833333333333375 | 1.64 | 2.01 |
| 21.85000000000004 | 1.65 | 2.01 |
| 21.866666666666706 | 1.66 | 2.01 |
| 21.883333333333372 | 1.67 | 2.01 |
| 21.900000000000038 | 1.68 | 2.01 |
| 21.916666666666703 | 1.69 | 2.01 |
| 21.93333333333337 | 1.7 | 2.01 |
| 21.950000000000035 | 1.71 | 2.01 |
| 21.9666666666667 | 1.72 | 2.01 |
| 21.983333333333366 | 1.72 | 2.01 |
| 22.000000000000032 | 1.74 | 2.01 |
| 22.016666666666698 | 1.76 | 2.01 |
| 22.033333333333363 | 1.78 | 2.01 |
| 22.05000000000003 | 1.8 | 2.01 |
| 22.066666666666695 | 1.81 | 2.01 |
| 22.08333333333336 | 1.83 | 2.01 |
| 22.100000000000026 | 1.84 | 2.01 |
| 22.116666666666692 | 1.86 | 2.01 |
| 22.133333333333358 | 1.87 | 2.01 |
| 22.150000000000023 | 1.89 | 2.01 |
| 22.16666666666669 | 1.9 | 2.01 |
| 22.183333333333355 | 1.92 | 2.01 |
| 22.20000000000002 | 1.94 | 2.01 |
| 22.216666666666686 | 1.95 | 2.01 |
| 22.233333333333352 | 1.97 | 2.01 |
| 22.250000000000018 | 1.98 | 2.01 |
| 22.266666666666683 | 2 | 2.01 |
| 22.28333333333335 | 2.01 | 2.01 |
| 22.300000000000015 | 2.01 | 2.01 |
| 22.31666666666668 | 2.01 | 2.01 |
| 22.333333333333346 | 2.01 | 2.01 |
| 22.350000000000012 | 2.01 | 2.01 |
| 22.366666666666678 | 2.01 | 2.01 |
| 22.383333333333344 | 2.01 | 2.01 |
| 22.40000000000001 | 2.01 | 2.01 |
| 22.416666666666675 | 2.01 | 2.01 |
| 22.43333333333334 | 2.01 | 2.01 |
| 22.450000000000006 | 2.01 | 2.01 |
| 22.466666666666672 | 2.01 | 2.01 |
| 22.483333333333338 | 2.01 | 2.01 |
| 22.500000000000004 | 2.01 | 2.01 |
| 22.51666666666667 | 2.01 | 2.01 |
| 22.533333333333335 | 2.01 | 2.01 |
| 22.55 | 2.01 | 2.01 |
| 22.566666666666666 | 2.01 | 2.01 |
| 22.583333333333332 | 2.01 | 2.01 |
| 22.599999999999998 | 2.01 | 2.01 |
| 22.616666666666664 | 2.01 | 2.01 |
| 22.63333333333333 | 2.01 | 2.01 |
| 22.649999999999995 | 2.01 | 2.01 |
| 22.66666666666666 | 2.01 | 2.01 |
| 22.683333333333326 | 2.01 | 2.01 |
| 22.699999999999992 | 2.01 | 2.01 |
| 22.716666666666658 | 2.01 | 2.01 |
| 22.733333333333324 | 2.01 | 2.01 |
| 22.74999999999999 | 2.01 | 2.01 |
| 22.766666666666655 | 2.01 | 2.01 |
| 22.78333333333332 | 2.01 | 2.01 |
| 22.799999999999986 | 2.01 | 2.01 |
| 22.816666666666652 | 2.01 | 2.01 |
| 22.833333333333318 | 2.01 | 2.01 |
| 22.849999999999984 | 2.01 | 2.01 |
| 22.86666666666665 | 2.01 | 2.01 |
| 22.883333333333315 | 2.01 | 2.01 |
| 22.89999999999998 | 2.01 | 2.01 |
| 22.916666666666647 | 2.01 | 2.01 |
| 22.933333333333312 | 2.01 | 2.01 |
| 22.949999999999978 | 2.01 | 2.01 |
| 22.966666666666644 | 2.01 | 2.01 |
| 22.98333333333331 | 2.01 | 2.01 |
| 22.999999999999975 | 2.01 | 2 |
| 23.01666666666664 | 2.01 | 2 |
| 23.033333333333307 | 2 | 1.99 |
| 23.049999999999972 | 2 | 1.98 |
| 23.066666666666638 | 2 | 1.97 |
| 23.083333333333304 | 2 | 1.96 |
| 23.09999999999997 | 2 | 1.95 |
| 23.116666666666635 | 2 | 1.94 |
| 23.1333333333333 | 2 | 1.93 |
| 23.149999999999967 | 2 | 1.92 |
| 23.166666666666632 | 2 | 1.91 |
| 23.183333333333298 | 2 | 1.89 |
| 23.199999999999964 | 2 | 1.88 |
| 23.21666666666663 | 2 | 1.87 |
| 23.233333333333295 | 2 | 1.86 |
| 23.24999999999996 | 2 | 1.85 |
| 23.266666666666627 | 2 | 1.84 |
| 23.283333333333292 | 2 | 1.83 |
| 23.299999999999958 | 2 | 1.82 |
| 23.316666666666624 | 2 | 1.81 |
| 23.33333333333329 | 2 | 1.8 |
| 23.349999999999955 | 2 | 1.79 |
| 23.36666666666662 | 2 | 1.78 |
| 23.383333333333287 | 2 | 1.77 |
| 23.399999999999952 | 2 | 1.76 |
| 23.416666666666618 | 2 | 1.75 |
| 23.433333333333284 | 2 | 1.74 |
| 23.44999999999995 | 2 | 1.74 |
| 23.466666666666615 | 2 | 1.73 |
| 23.48333333333328 | 2 | 1.72 |
| 23.499999999999947 | 2 | 1.71 |
| 23.516666666666612 | 2 | 1.7 |
| 23.533333333333278 | 2 | 1.69 |
| 23.549999999999944 | 2 | 1.68 |
| 23.56666666666661 | 2 | 1.67 |
| 23.583333333333275 | 2 | 1.66 |
| 23.59999999999994 | 2 | 1.65 |
| 23.616666666666607 | 2 | 1.64 |
| 23.633333333333272 | 2 | 1.63 |
| 23.649999999999938 | 2 | 1.62 |
| 23.666666666666604 | 2 | 1.61 |
| 23.68333333333327 | 2 | 1.61 |
| 23.699999999999935 | 2 | 1.6 |
| 23.7166666666666 | 2 | 1.59 |
| 23.733333333333267 | 2 | 1.58 |
| 23.749999999999932 | 2 | 1.57 |
| 23.766666666666598 | 2 | 1.56 |
| 23.783333333333264 | 2 | 1.55 |
| 23.79999999999993 | 2 | 1.55 |
| 23.816666666666595 | 2 | 1.54 |
| 23.83333333333326 | 2 | 1.53 |
| 23.849999999999927 | 2 | 1.52 |
| 23.866666666666593 | 2 | 1.51 |
| 23.88333333333326 | 2 | 1.5 |
| 23.899999999999924 | 2 | 1.49 |
| 23.91666666666659 | 2 | 1.49 |
| 23.933333333333255 | 2 | 1.48 |
| 23.94999999999992 | 2 | 1.47 |
| 23.966666666666587 | 2 | 1.46 |
| 23.983333333333253 | 2 | 1.45 |
| 23.99999999999992 | 2 | 1.45 |
| 24.016666666666584 | 2.01 | 1.44 |
| 24.03333333333325 | 2.01 | 1.44 |
| 24.049999999999915 | 2.01 | 1.44 |
| 24.06666666666658 | 2.01 | 1.44 |
| 24.083333333333247 | 2.01 | 1.44 |
| 24.099999999999913 | 2.01 | 1.44 |
| 24.11666666666658 | 2.01 | 1.44 |
| 24.133333333333244 | 2.01 | 1.44 |
| 24.14999999999991 | 2.01 | 1.44 |
| 24.166666666666575 | 2.01 | 1.44 |
| 24.18333333333324 | 2.01 | 1.44 |
| 24.199999999999907 | 2.01 | 1.44 |
| 24.216666666666573 | 2.01 | 1.44 |
| 24.23333333333324 | 2.01 | 1.44 |
| 24.249999999999904 | 2.01 | 1.44 |
| 24.26666666666657 | 2.01 | 1.44 |
| 24.283333333333236 | 2.01 | 1.44 |
| 24.2999999999999 | 2.01 | 1.44 |
| 24.316666666666567 | 2.01 | 1.44 |
| 24.333333333333233 | 2.01 | 1.44 |
| 24.3499999999999 | 2.01 | 1.44 |
| 24.366666666666564 | 2.01 | 1.44 |
| 24.38333333333323 | 2.01 | 1.44 |
| 24.399999999999896 | 2.01 | 1.44 |
| 24.41666666666656 | 2.01 | 1.44 |
| 24.433333333333227 | 2.01 | 1.44 |
| 24.449999999999893 | 2.01 | 1.44 |
| 24.46666666666656 | 2.01 | 1.44 |
| 24.483333333333224 | 2.01 | 1.44 |
| 24.49999999999989 | 2.01 | 1.44 |
| 24.516666666666556 | 2.01 | 1.44 |
| 24.53333333333322 | 2.01 | 1.44 |
| 24.549999999999887 | 2.01 | 1.44 |
| 24.566666666666553 | 2.01 | 1.44 |
| 24.58333333333322 | 2.01 | 1.44 |
| 24.599999999999884 | 2.01 | 1.44 |
| 24.61666666666655 | 2.01 | 1.44 |
| 24.633333333333216 | 2.01 | 1.44 |
| 24.64999999999988 | 2.01 | 1.44 |
| 24.666666666666547 | 2.01 | 1.44 |
| 24.683333333333213 | 2.01 | 1.44 |
| 24.69999999999988 | 2.01 | 1.44 |
| 24.716666666666544 | 2.01 | 1.44 |
| 24.73333333333321 | 2.01 | 1.44 |
| 24.749999999999876 | 2.01 | 1.44 |
| 24.76666666666654 | 2.01 | 1.44 |
| 24.783333333333207 | 2.01 | 1.44 |
| 24.799999999999873 | 2.01 | 1.44 |
| 24.81666666666654 | 2.01 | 1.44 |
| 24.833333333333204 | 2.01 | 1.44 |
| 24.84999999999987 | 2.01 | 1.44 |
| 24.866666666666536 | 2.01 | 1.44 |
| 24.8833333333332 | 2.01 | 1.44 |
| 24.899999999999867 | 2.01 | 1.44 |
| 24.916666666666533 | 2.01 | 1.44 |
| 24.9333333333332 | 2.01 | 1.44 |
| 24.949999999999864 | 2.01 | 1.44 |
| 24.96666666666653 | 2.01 | 1.44 |
| 24.983333333333196 | 2.01 | 1.44 |
| 24.99999999999986 | 2 | 1.43 |